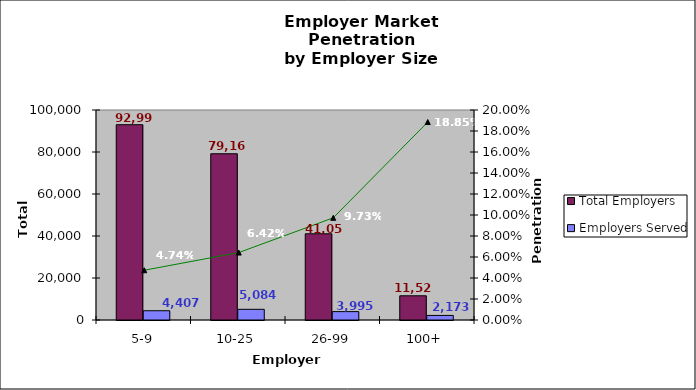
| Category | Total Employers | Employers Served |
|---|---|---|
| 5-9 | 92992 | 4407 |
| 10-25 | 79160 | 5084 |
| 26-99 | 41053 | 3995 |
| 100+ | 11526 | 2173 |